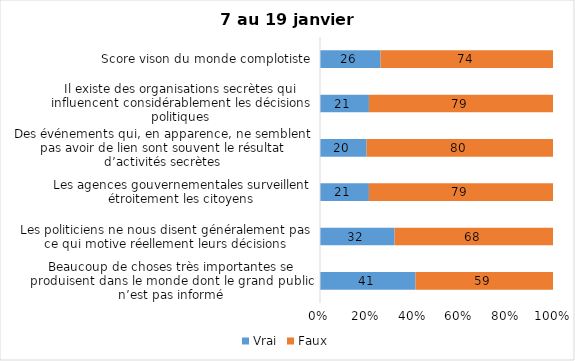
| Category | Vrai | Faux |
|---|---|---|
| Beaucoup de choses très importantes se produisent dans le monde dont le grand public n’est pas informé | 41 | 59 |
| Les politiciens ne nous disent généralement pas ce qui motive réellement leurs décisions | 32 | 68 |
| Les agences gouvernementales surveillent étroitement les citoyens | 21 | 79 |
| Des événements qui, en apparence, ne semblent pas avoir de lien sont souvent le résultat d’activités secrètes | 20 | 80 |
| Il existe des organisations secrètes qui influencent considérablement les décisions politiques | 21 | 79 |
| Score vison du monde complotiste | 26 | 74 |